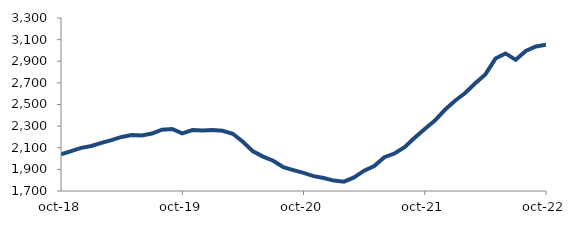
| Category | Series 0 |
|---|---|
| 2018-10-01 | 2039.821 |
| 2018-11-01 | 2068.002 |
| 2018-12-01 | 2098.706 |
| 2019-01-01 | 2116.727 |
| 2019-02-01 | 2144.876 |
| 2019-03-01 | 2171.077 |
| 2019-04-01 | 2199.941 |
| 2019-05-01 | 2218.125 |
| 2019-06-01 | 2213.708 |
| 2019-07-01 | 2231.834 |
| 2019-08-01 | 2267.321 |
| 2019-09-01 | 2273.768 |
| 2019-10-01 | 2233.304 |
| 2019-11-01 | 2263.898 |
| 2019-12-01 | 2259.926 |
| 2020-01-01 | 2265.053 |
| 2020-02-01 | 2256.766 |
| 2020-03-01 | 2229.161 |
| 2020-04-01 | 2155.791 |
| 2020-05-01 | 2066.843 |
| 2020-06-01 | 2018.026 |
| 2020-07-01 | 1979.558 |
| 2020-08-01 | 1920.368 |
| 2020-09-01 | 1893.237 |
| 2020-10-01 | 1867.4 |
| 2020-11-01 | 1837.195 |
| 2020-12-01 | 1819.546 |
| 2021-01-01 | 1796.45 |
| 2021-02-01 | 1786.603 |
| 2021-03-01 | 1826.072 |
| 2021-04-01 | 1887.798 |
| 2021-05-01 | 1930.372 |
| 2021-06-01 | 2012.926 |
| 2021-07-01 | 2046.434 |
| 2021-08-01 | 2105.806 |
| 2021-09-01 | 2192.514 |
| 2021-10-01 | 2272.972 |
| 2021-11-01 | 2351.334 |
| 2021-12-01 | 2451.171 |
| 2022-01-01 | 2534.613 |
| 2022-02-01 | 2606.357 |
| 2022-03-01 | 2696.948 |
| 2022-04-01 | 2778.264 |
| 2022-05-01 | 2924.682 |
| 2022-06-01 | 2972.281 |
| 2022-07-01 | 2912.933 |
| 2022-08-01 | 2994.913 |
| 2022-09-01 | 3036.467 |
| 2022-10-01 | 3052.236 |